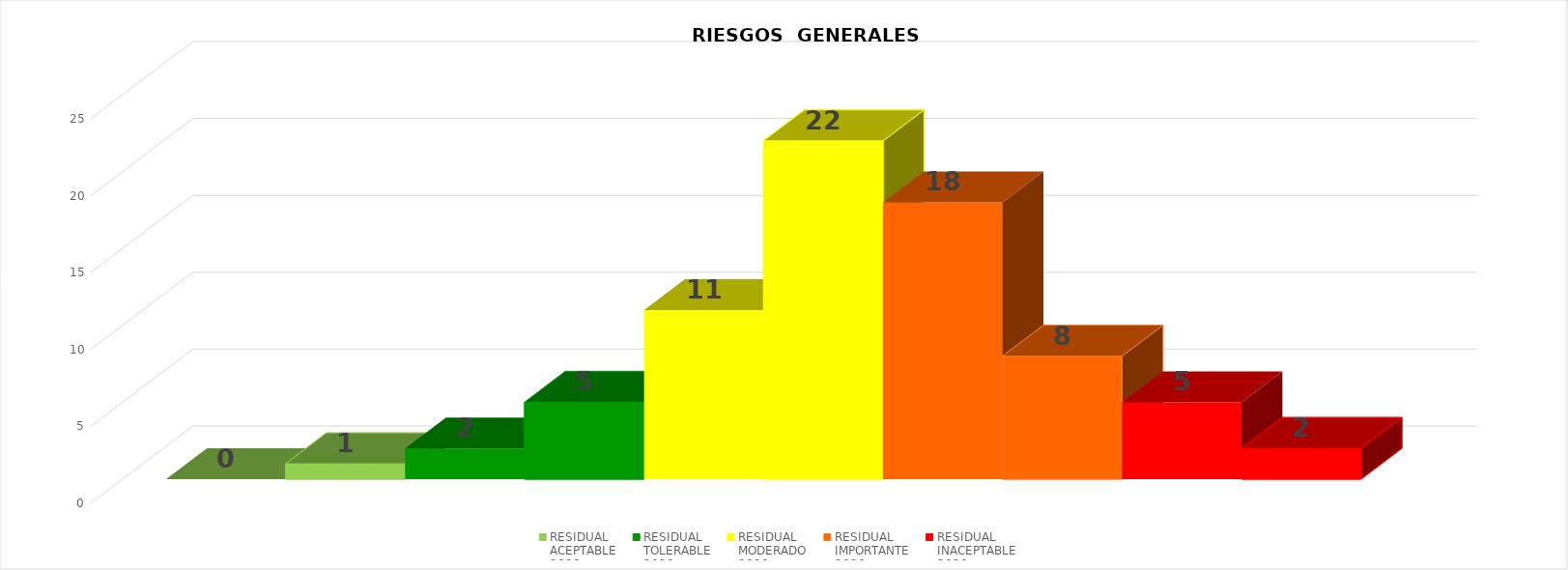
| Category | INHERENTE
ACEPTABLE
2020 | RESIDUAL
ACEPTABLE
2020 | INHERENTE
TOLERABLE
2020 | RESIDUAL
TOLERABLE
2020 | INHERENTE
MODERADO
2020 | RESIDUAL
MODERADO
2020 | INHERENTE
IMPORTANTE
2020 | RESIDUAL
IMPORTANTE
2020 | INHERENTE
INACEPTABLE
2020 | RESIDUAL
INACEPTABLE
2020 |
|---|---|---|---|---|---|---|---|---|---|---|
| TOTAL RIESGOS POR AÑO | 0 | 1 | 2 | 5 | 11 | 22 | 18 | 8 | 5 | 2 |